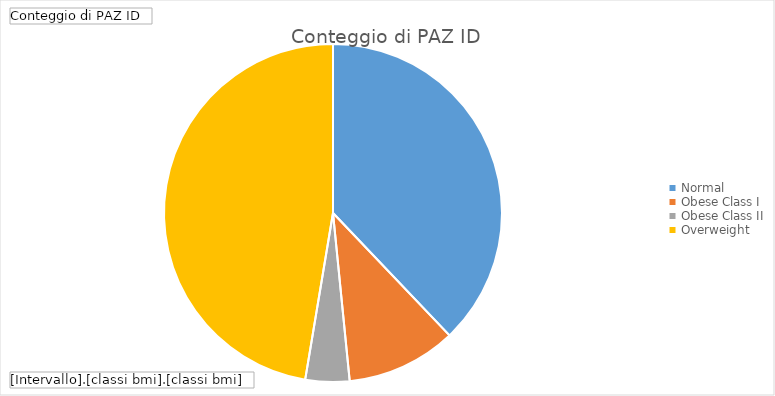
| Category | Totale |
|---|---|
| Normal | 36 |
| Obese Class I | 10 |
| Obese Class II | 4 |
| Overweight | 45 |